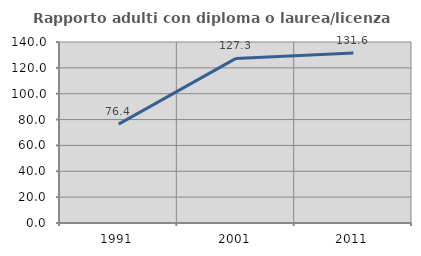
| Category | Rapporto adulti con diploma o laurea/licenza media  |
|---|---|
| 1991.0 | 76.433 |
| 2001.0 | 127.329 |
| 2011.0 | 131.551 |